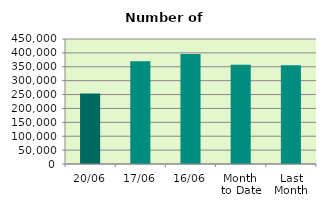
| Category | Series 0 |
|---|---|
| 20/06 | 254008 |
| 17/06 | 370312 |
| 16/06 | 396038 |
| Month 
to Date | 357483.077 |
| Last
Month | 355289.273 |